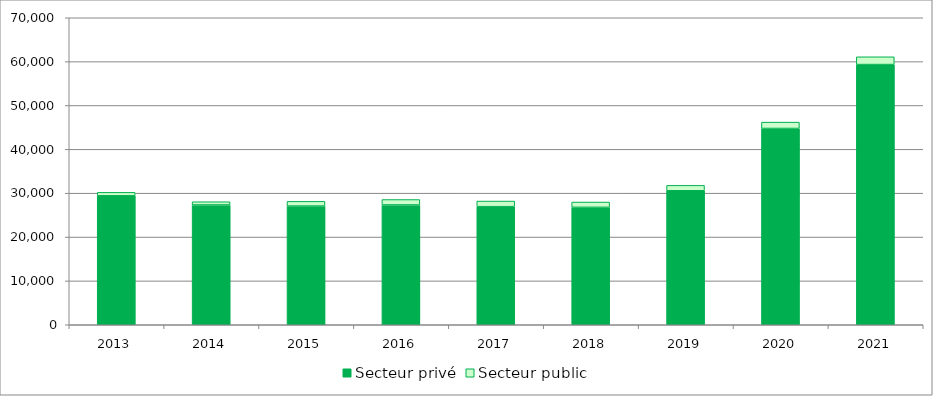
| Category | Secteur privé | Secteur public |
|---|---|---|
| 2013.0 | 29398 | 793 |
| 2014.0 | 27315 | 732 |
| 2015.0 | 27065 | 1070 |
| 2016.0 | 27313 | 1240 |
| 2017.0 | 26928 | 1276 |
| 2018.0 | 26772 | 1206 |
| 2019.0 | 30550 | 1234 |
| 2020.0 | 44752 | 1447 |
| 2021.0 | 59326 | 1774 |